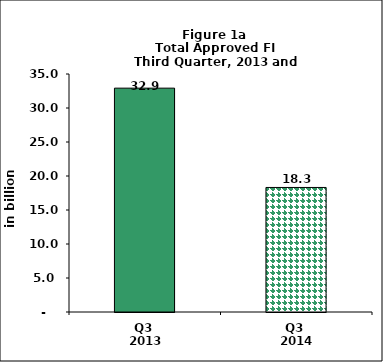
| Category | Series 0 |
|---|---|
| Q3 
2013 | 32.92 |
| Q3 
2014 | 18.314 |